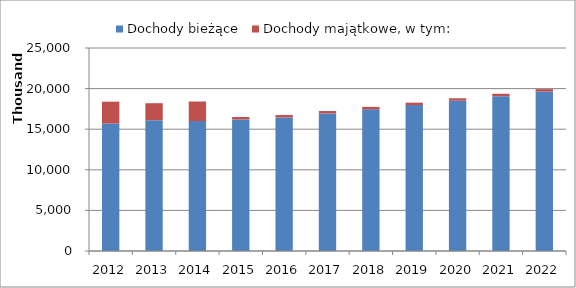
| Category | Dochody bieżące | Dochody majątkowe, w tym: |
|---|---|---|
| 2012.0 | 15699914.92 | 2687994 |
| 2013.0 | 16107759 | 2093000 |
| 2014.0 | 16000000 | 2408000 |
| 2015.0 | 16200000 | 300000 |
| 2016.0 | 16443950 | 300000 |
| 2017.0 | 16937269 | 300000 |
| 2018.0 | 17445387 | 300000 |
| 2019.0 | 17968748 | 300000 |
| 2020.0 | 18507811 | 300000 |
| 2021.0 | 19063045 | 300000 |
| 2022.0 | 19634936 | 300000 |